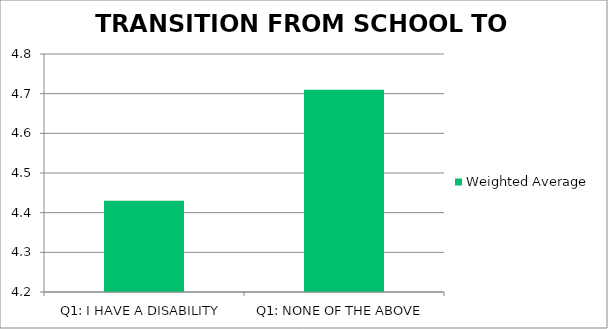
| Category | Weighted Average |
|---|---|
| Q1: I HAVE A DISABILITY | 4.43 |
| Q1: NONE OF THE ABOVE | 4.71 |